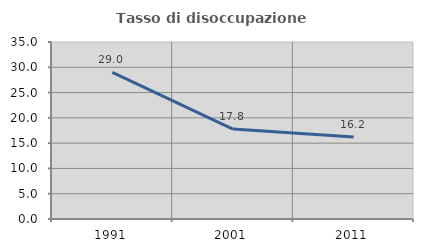
| Category | Tasso di disoccupazione giovanile  |
|---|---|
| 1991.0 | 29 |
| 2001.0 | 17.778 |
| 2011.0 | 16.216 |